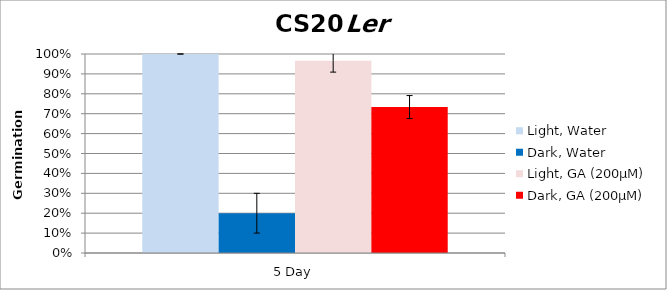
| Category | Light, Water | Dark, Water | Light, GA (200µM) | Dark, GA (200µM) |
|---|---|---|---|---|
| 5 Day | 1 | 0.2 | 0.967 | 0.733 |